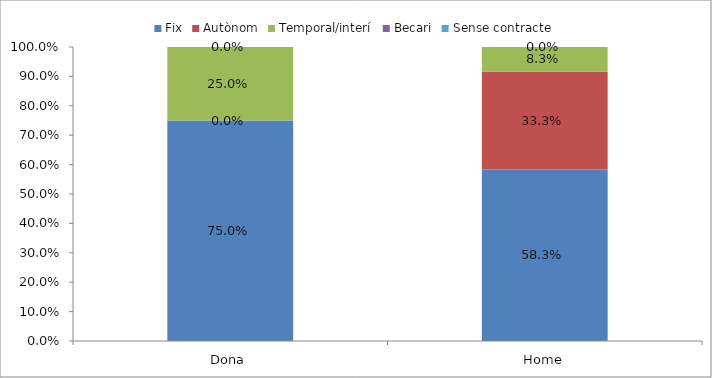
| Category | Fix | Autònom | Temporal/interí | Becari | Sense contracte |
|---|---|---|---|---|---|
| Dona | 0.75 | 0 | 0.25 | 0 | 0 |
| Home | 0.583 | 0.333 | 0.083 | 0 | 0 |